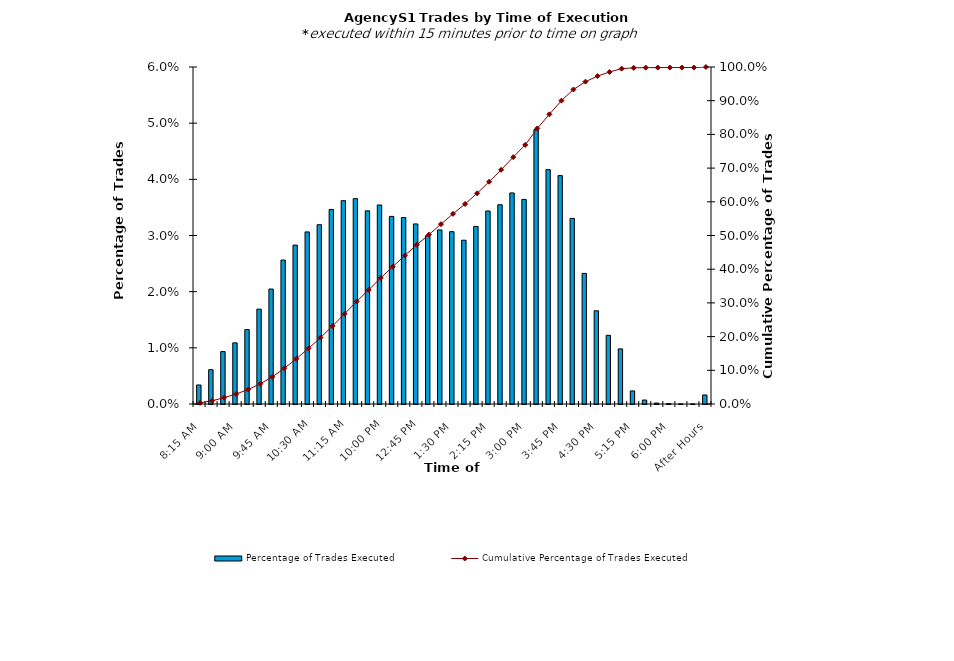
| Category | Percentage of Trades Executed |
|---|---|
| 8:15 AM | 0.003 |
| 8:30 AM | 0.006 |
| 8:45 AM | 0.009 |
| 9:00 AM | 0.011 |
| 9:15 AM | 0.013 |
| 9:30 AM | 0.017 |
| 9:45 AM | 0.02 |
| 10:00 AM | 0.026 |
| 10:15 AM | 0.028 |
| 10:30 AM | 0.031 |
| 10:45 AM | 0.032 |
| 11:00 AM | 0.035 |
| 11:15 AM | 0.036 |
| 11:30 AM | 0.037 |
| 11:45 AM | 0.034 |
| 12:00 PM | 0.035 |
| 12:15 PM | 0.033 |
| 12:30 PM | 0.033 |
| 12:45 PM | 0.032 |
| 1:00 PM | 0.03 |
| 1:15 PM | 0.031 |
| 1:30 PM | 0.031 |
| 1:45 PM | 0.029 |
| 2:00 PM | 0.032 |
| 2:15 PM | 0.034 |
| 2:30 PM | 0.035 |
| 2:45 PM | 0.038 |
| 3:00 PM | 0.036 |
| 3:15 PM | 0.049 |
| 3:30 PM | 0.042 |
| 3:45 PM | 0.041 |
| 4:00 PM | 0.033 |
| 4:15 PM | 0.023 |
| 4:30 PM | 0.017 |
| 4:45 PM | 0.012 |
| 5:00 PM | 0.01 |
| 5:15 PM | 0.002 |
| 5:30 PM | 0.001 |
| 5:45 PM | 0 |
| 6:00 PM | 0 |
| 6:15 PM | 0 |
| 6:30 PM | 0 |
| After Hours | 0.002 |